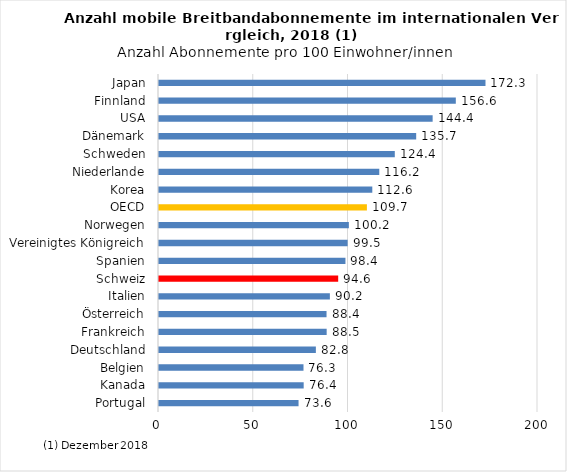
| Category | Series 0 |
|---|---|
| Portugal | 73.64 |
| Kanada | 76.35 |
| Belgien | 76.25 |
| Deutschland | 82.78 |
| Frankreich | 88.48 |
| Österreich | 88.41 |
| Italien | 90.17 |
| Schweiz | 94.56 |
| Spanien | 98.39 |
| Vereinigtes Königreich | 99.54 |
| Norwegen | 100.19 |
| OECD | 109.71 |
| Korea | 112.56 |
| Niederlande | 116.24 |
| Schweden | 124.43 |
| Dänemark | 135.72 |
| USA | 144.4 |
| Finnland | 156.63 |
| Japan | 172.29 |